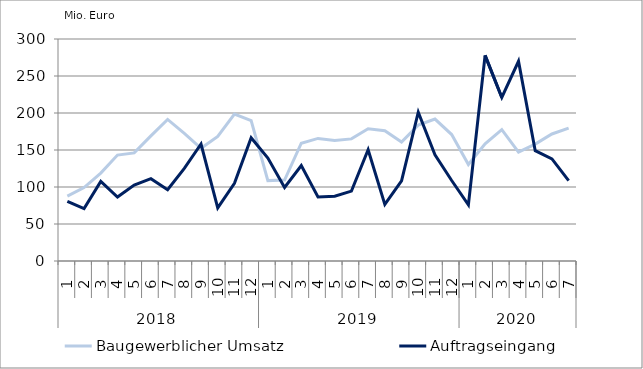
| Category | Baugewerblicher Umsatz | Auftragseingang |
|---|---|---|
| 0 | 87640.529 | 80684.627 |
| 1 | 99259.455 | 70746.763 |
| 2 | 118764.324 | 107538.747 |
| 3 | 143144.178 | 86374.619 |
| 4 | 146070.782 | 102661.329 |
| 5 | 169150.753 | 111287.709 |
| 6 | 191277.885 | 96286.662 |
| 7 | 172425.535 | 125142.495 |
| 8 | 152354.98 | 158112.302 |
| 9 | 168372.756 | 71808.619 |
| 10 | 198558.472 | 104904.147 |
| 11 | 189665.914 | 166653.461 |
| 12 | 108616.605 | 139065.287 |
| 13 | 109331.58 | 99318.609 |
| 14 | 159117.81 | 129002.041 |
| 15 | 165654.287 | 86579.2 |
| 16 | 162976.056 | 87644.362 |
| 17 | 165026.188 | 94463.186 |
| 18 | 178622.938 | 150345.08 |
| 19 | 176074.101 | 76434.317 |
| 20 | 160663.041 | 108444.162 |
| 21 | 183589.485 | 201122.697 |
| 22 | 191777.213 | 143514.792 |
| 23 | 170885.223 | 108780.022 |
| 24 | 130445.562 | 75891.481 |
| 25 | 158433.655 | 277923.85 |
| 26 | 177529.832 | 220973.626 |
| 27 | 147259.799 | 269936.091 |
| 28 | 157965.891 | 149072.895 |
| 29 | 171647.778 | 137984.76 |
| 30 | 179530.732 | 108645.965 |